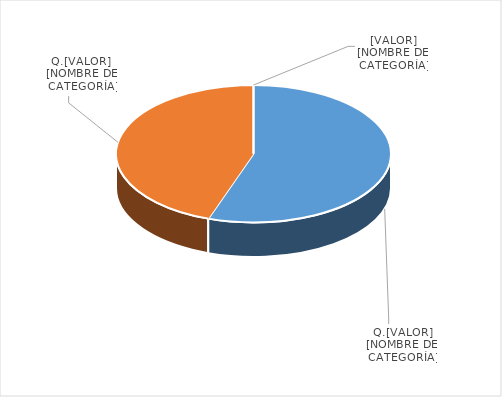
| Category | Series 0 |
|---|---|
| PRESUPUESTO VIGENTE PARA 2023 | 19000000 |
| PRESUPUESTO EJECUTADO  | 15337357.49 |
| PORCENTAJE DE EJECUCIÓN  | 0.807 |